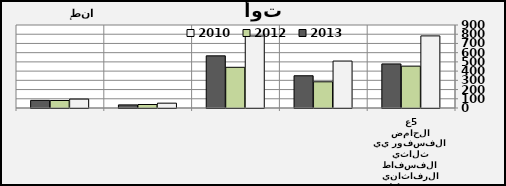
| Category | 2010 | 2012 | 2013 |
|---|---|---|---|
| 0 | 781.785 | 454.029 | 477.806 |
| 1 | 509.13 | 283.97 | 349.668 |
| 2 | 780.6 | 441.328 | 565.434 |
| 3 | 52.38 | 37.91 | 33.59 |
| 4 | 96.63 | 81.18 | 82.514 |